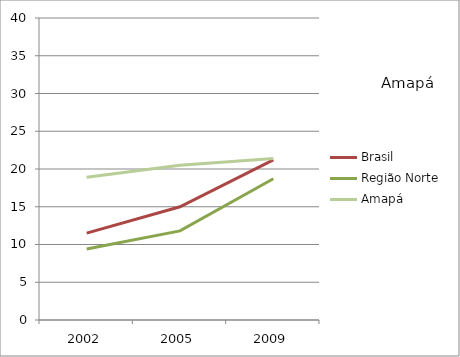
| Category | Brasil | Região Norte | Amapá |
|---|---|---|---|
| 2002.0 | 11.5 | 9.4 | 18.9 |
| 2005.0 | 15 | 11.8 | 20.5 |
| 2009.0 | 21.2 | 18.7 | 21.4 |